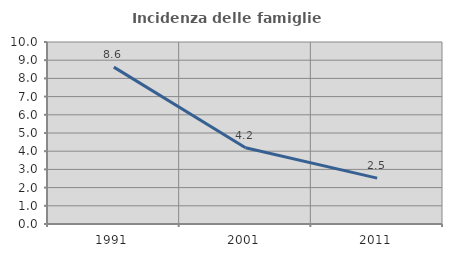
| Category | Incidenza delle famiglie numerose |
|---|---|
| 1991.0 | 8.619 |
| 2001.0 | 4.186 |
| 2011.0 | 2.522 |